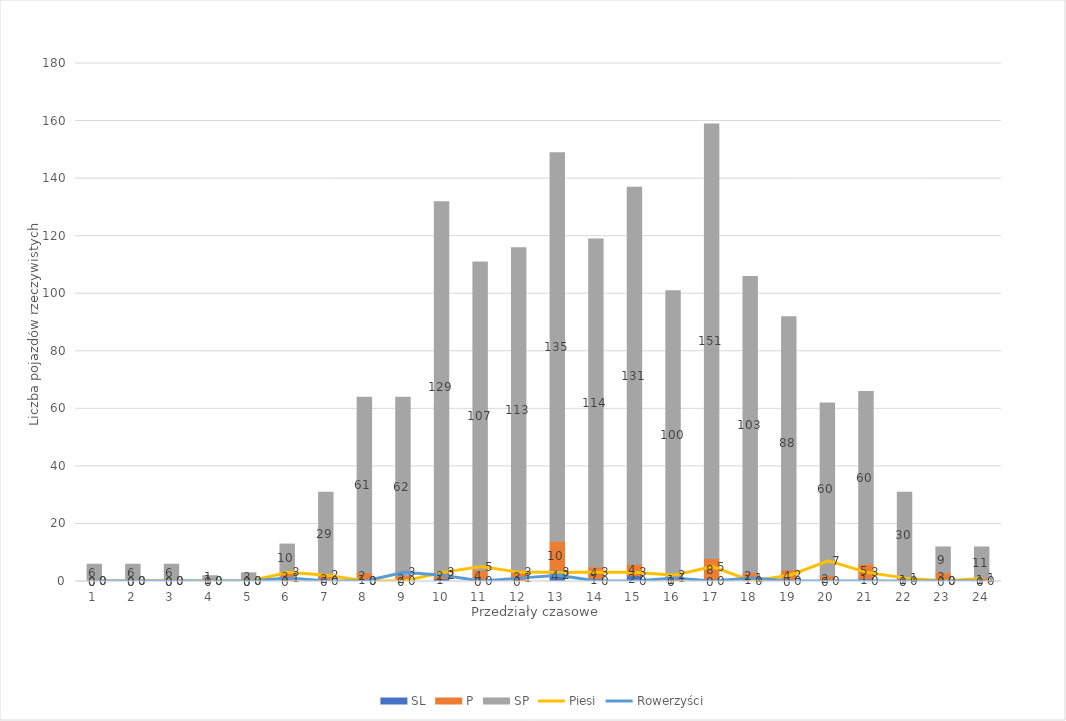
| Category | SL | P | SP |
|---|---|---|---|
| 0 | 0 | 0 | 6 |
| 1 | 0 | 0 | 6 |
| 2 | 0 | 0 | 6 |
| 3 | 0 | 1 | 1 |
| 4 | 0 | 0 | 3 |
| 5 | 0 | 3 | 10 |
| 6 | 0 | 2 | 29 |
| 7 | 1 | 2 | 61 |
| 8 | 0 | 2 | 62 |
| 9 | 1 | 2 | 129 |
| 10 | 0 | 4 | 107 |
| 11 | 0 | 3 | 113 |
| 12 | 4 | 10 | 135 |
| 13 | 1 | 4 | 114 |
| 14 | 2 | 4 | 131 |
| 15 | 0 | 1 | 100 |
| 16 | 0 | 8 | 151 |
| 17 | 1 | 2 | 103 |
| 18 | 0 | 4 | 88 |
| 19 | 0 | 2 | 60 |
| 20 | 1 | 5 | 60 |
| 21 | 0 | 1 | 30 |
| 22 | 0 | 3 | 9 |
| 23 | 0 | 1 | 11 |